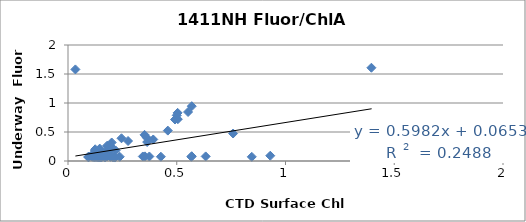
| Category | Series 0 |
|---|---|
| 0.197 | 0.088 |
| 0.344 | 0.078 |
| 0.159 | 0.073 |
| 0.154 | 0.068 |
| 0.171 | 0.07 |
| 0.182 | 0.086 |
| 0.148 | 0.076 |
| 0.131 | 0.082 |
| 0.162 | 0.086 |
| 0.201 | 0.08 |
| 0.13 | 0.076 |
| 0.121 | 0.074 |
| 0.134 | 0.073 |
| 0.146 | 0.214 |
| 0.143 | 0.076 |
| 0.094 | 0.074 |
| 0.113 | 0.074 |
| 0.124 | 0.066 |
| 0.133 | 0.069 |
| 0.152 | 0.065 |
| 0.14 | 0.061 |
| 0.117 | 0.072 |
| 0.147 | 0.062 |
| 0.148 | 0.068 |
| 0.21 | 0.062 |
| 0.216 | 0.06 |
| 0.195 | 0.072 |
| 0.169 | 0.066 |
| 0.238 | 0.073 |
| 0.567 | 0.073 |
| 0.633 | 0.079 |
| 0.845 | 0.072 |
| 0.374 | 0.078 |
| 0.206 | 0.067 |
| 0.172 | 0.069 |
| 0.178 | 0.078 |
| 0.427 | 0.074 |
| 0.569 | 0.082 |
| 0.354 | 0.08 |
| 0.93 | 0.091 |
| 0.189 | 0.2 |
| 0.141 | 0.127 |
| 0.109 | 0.099 |
| 0.122 | 0.079 |
| 0.096 | 0.076 |
| 0.094 | 0.063 |
| 0.107 | 0.083 |
| 0.124 | 0.182 |
| 0.18 | 0.264 |
| 0.149 | 0.182 |
| 0.362 | 0.402 |
| 1.395 | 1.608 |
| 0.552 | 0.845 |
| 0.569 | 0.945 |
| 0.276 | 0.345 |
| 0.189 | 0.183 |
| 0.246 | 0.392 |
| 0.126 | 0.171 |
| 0.125 | 0.202 |
| 0.167 | 0.141 |
| 0.197 | 0.254 |
| 0.201 | 0.319 |
| 0.392 | 0.371 |
| 0.364 | 0.327 |
| 0.352 | 0.451 |
| 0.505 | 0.721 |
| 0.504 | 0.83 |
| 0.5 | 0.787 |
| 0.459 | 0.524 |
| 0.759 | 0.474 |
| 0.219 | 0.182 |
| 1.396 | 0.586 |
| 0.492 | 0.715 |
| 0.034 | 1.579 |